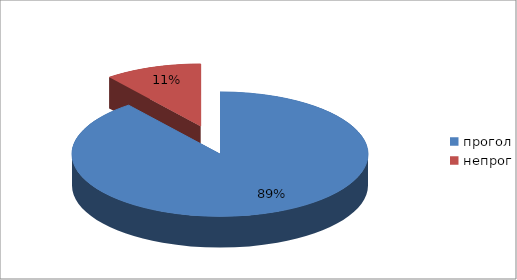
| Category | Series 0 |
|---|---|
| прогол | 76 |
| непрог | 9 |